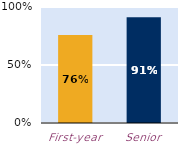
| Category | At least some |
|---|---|
| First-year | 0.759 |
| Senior | 0.912 |